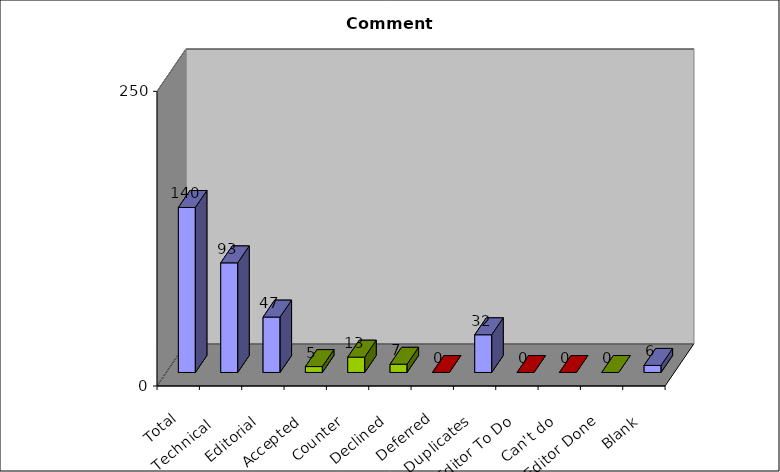
| Category | Series 0 |
|---|---|
| Total | 140 |
| Technical  | 93 |
| Editorial | 47 |
| Accepted | 5 |
| Counter | 13 |
| Declined | 7 |
| Deferred | 0 |
| Duplicates | 32 |
| Editor To Do | 0 |
| Can't do | 0 |
| Editor Done | 0 |
| Blank | 6 |